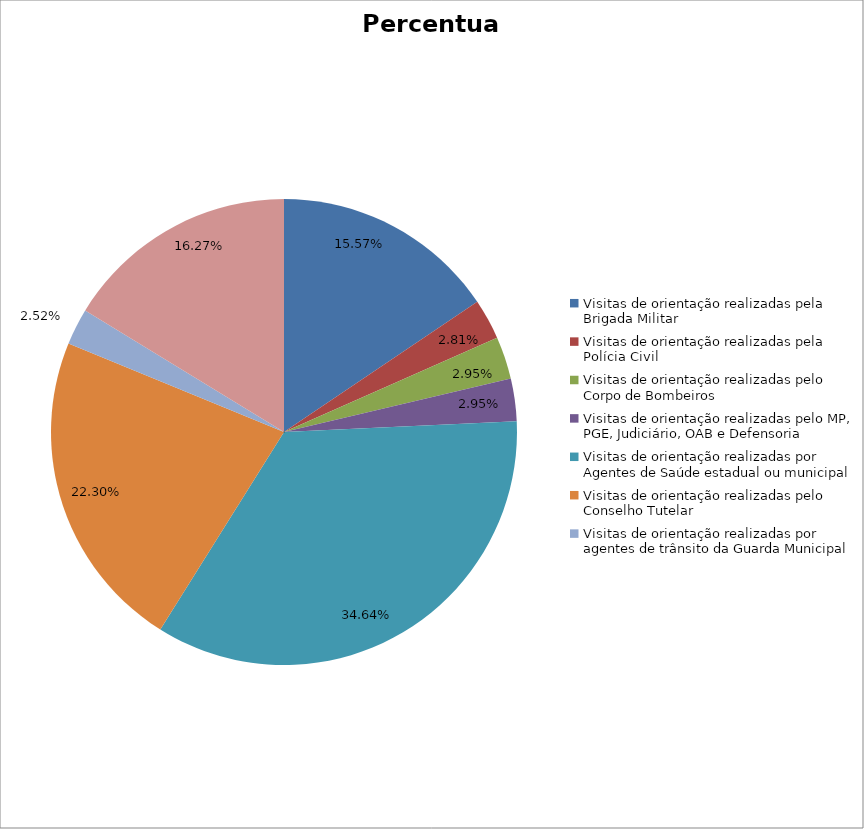
| Category | Percentual |
|---|---|
| Visitas de orientação realizadas pela Brigada Militar | 0.156 |
| Visitas de orientação realizadas pela Polícia Civil | 0.028 |
| Visitas de orientação realizadas pelo Corpo de Bombeiros | 0.029 |
| Visitas de orientação realizadas pelo MP, PGE, Judiciário, OAB e Defensoria | 0.029 |
| Visitas de orientação realizadas por Agentes de Saúde estadual ou municipal | 0.346 |
| Visitas de orientação realizadas pelo Conselho Tutelar | 0.223 |
| Visitas de orientação realizadas por agentes de trânsito da Guarda Municipal | 0.025 |
| Visitas de orientação realizadas por ONGs, entidades privadas, CRAS e CREAS | 0.163 |